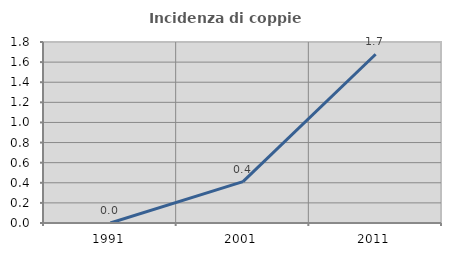
| Category | Incidenza di coppie miste |
|---|---|
| 1991.0 | 0 |
| 2001.0 | 0.412 |
| 2011.0 | 1.678 |